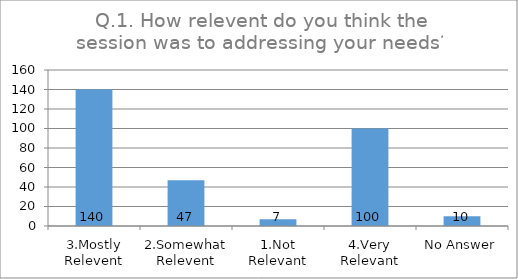
| Category | Q.1. How relevent do you think the session was to addressing your needs? |
|---|---|
| 3.Mostly Relevent | 140 |
| 2.Somewhat Relevent | 47 |
| 1.Not Relevant | 7 |
| 4.Very Relevant | 100 |
| No Answer | 10 |